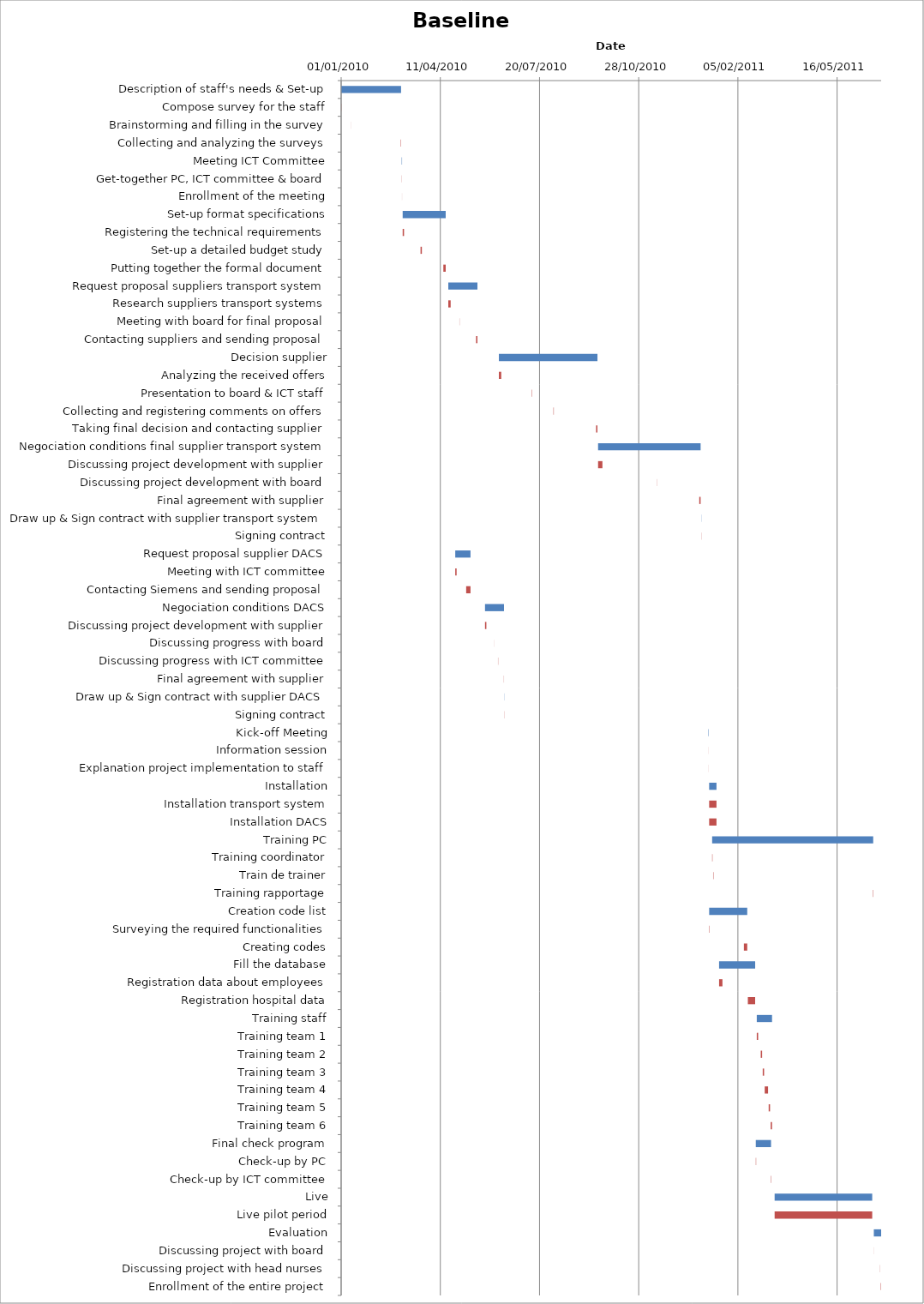
| Category | Baseline start | Actual duration |
|---|---|---|
| Description of staff's needs & Set-up | 40179.333 | 60.375 |
| Compose survey for the staff | 40179.333 | 0.167 |
| Brainstorming and filling in the survey | 40189.542 | 0.083 |
| Collecting and analyzing the surveys | 40239.333 | 0.375 |
| Meeting ICT Committee | 40240.333 | 0.375 |
| Get-together PC, ICT committee & board | 40240.333 | 0.167 |
| Enrollment of the meeting | 40240.625 | 0.083 |
| Set-up format specifications | 40241.333 | 43.375 |
| Registering the technical requirements | 40241.333 | 1.375 |
| Set-up a detailed budget study | 40259.333 | 1.375 |
| Putting together the formal document | 40282.333 | 2.375 |
| Request proposal suppliers transport system | 40287.333 | 29.375 |
| Research suppliers transport systems | 40287.333 | 2.375 |
| Meeting with board for final proposal | 40298.542 | 0.167 |
| Contacting suppliers and sending proposal | 40315.333 | 1.375 |
| Decision supplier | 40338.333 | 99.375 |
| Analyzing the received offers | 40338.333 | 2.375 |
| Presentation to board & ICT staff | 40371.333 | 0.375 |
| Collecting and registering comments on offers | 40393.333 | 0.375 |
| Taking final decision and contacting supplier | 40436.333 | 1.375 |
| Negociation conditions final supplier transport system | 40438.333 | 103.375 |
| Discussing project development with supplier | 40438.333 | 4.375 |
| Discussing project development with board | 40497.542 | 0.167 |
| Final agreement with supplier | 40540.333 | 1.375 |
| Draw up & Sign contract with supplier transport system | 40542.333 | 0.167 |
| Signing contract | 40542.333 | 0.167 |
| Request proposal supplier DACS | 40294.333 | 15.375 |
| Meeting with ICT committee | 40294.333 | 1.375 |
| Contacting Siemens and sending proposal | 40305.333 | 4.375 |
| Negociation conditions DACS | 40324.333 | 19.167 |
| Discussing project development with supplier | 40324.333 | 1.375 |
| Discussing progress with board | 40333.333 | 0.083 |
| Discussing progress with ICT committee | 40337.417 | 0.208 |
| Final agreement with supplier | 40343.333 | 0.167 |
| Draw up & Sign contract with supplier DACS | 40343.542 | 0.167 |
| Signing contract | 40343.542 | 0.167 |
| Kick-off Meeting | 40549.333 | 0.375 |
| Information session | 40549.333 | 0.083 |
| Explanation project implementation to staff | 40549.625 | 0.083 |
| Installation | 40550.333 | 7.375 |
| Installation transport system | 40550.333 | 7.375 |
| Installation DACS | 40550.333 | 7.375 |
| Training PC | 40553.333 | 162.375 |
| Training coordinator | 40553.333 | 0.375 |
| Train de trainer | 40554.333 | 0.375 |
| Training rapportage | 40715.333 | 0.375 |
| Creation code list | 40550.333 | 38.375 |
| Surveying the required functionalities | 40550.333 | 0.375 |
| Creating codes | 40585.333 | 3.375 |
| Fill the database | 40560.333 | 36.375 |
| Registration data about employees | 40560.333 | 3.375 |
| Registration hospital data | 40589.333 | 7.375 |
| Training staff | 40598.333 | 15.375 |
| Training team 1 | 40598.333 | 1.375 |
| Training team 2 | 40602.333 | 1.375 |
| Training team 3 | 40604.333 | 1.375 |
| Training team 4 | 40606.333 | 3.375 |
| Training team 5 | 40610.333 | 1.375 |
| Training team 6 | 40612.333 | 1.375 |
| Final check program | 40597.333 | 15.375 |
| Check-up by PC | 40597.333 | 0.375 |
| Check-up by ICT committee | 40612.333 | 0.375 |
| Live | 40616.333 | 98.375 |
| Live pilot period | 40616.333 | 98.375 |
| Evaluation | 40716.333 | 7.375 |
| Discussing project with board | 40716.333 | 0.083 |
| Discussing project with head nurses | 40722.542 | 0.167 |
| Enrollment of the entire project | 40723.333 | 0.375 |